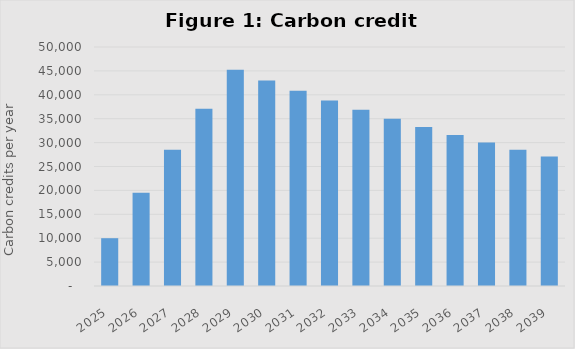
| Category | Series 0 |
|---|---|
| 2025.0 | 10000 |
| 2026.0 | 19500 |
| 2027.0 | 28525 |
| 2028.0 | 37098.75 |
| 2029.0 | 45243.812 |
| 2030.0 | 42981.622 |
| 2031.0 | 40832.541 |
| 2032.0 | 38790.914 |
| 2033.0 | 36851.368 |
| 2034.0 | 35008.8 |
| 2035.0 | 33258.36 |
| 2036.0 | 31595.442 |
| 2037.0 | 30015.67 |
| 2038.0 | 28514.886 |
| 2039.0 | 27089.142 |